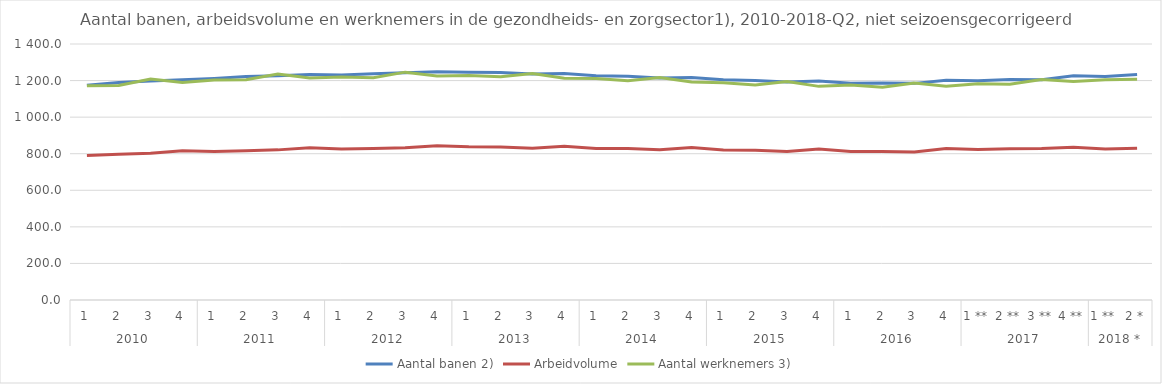
| Category | Aantal banen 2) | Arbeidvolume | Aantal werknemers 3) |
|---|---|---|---|
| 0 | 1174.1 | 790.1 | 1171.6 |
| 1 | 1188.8 | 797.6 | 1173.6 |
| 2 | 1197.1 | 803.1 | 1208.2 |
| 3 | 1204.2 | 815.8 | 1189.1 |
| 4 | 1211.8 | 811.6 | 1203.2 |
| 5 | 1221.6 | 816.1 | 1204 |
| 6 | 1227 | 821 | 1235.5 |
| 7 | 1233.2 | 833.2 | 1213.5 |
| 8 | 1231.1 | 825.2 | 1218.9 |
| 9 | 1237.8 | 828.9 | 1215.3 |
| 10 | 1242.9 | 833 | 1246.1 |
| 11 | 1248.8 | 844.2 | 1224.5 |
| 12 | 1245.5 | 837.8 | 1228.4 |
| 13 | 1243.5 | 837 | 1221.1 |
| 14 | 1236.2 | 830.2 | 1238.1 |
| 15 | 1238.5 | 840.7 | 1212.7 |
| 16 | 1227 | 828.8 | 1211.7 |
| 17 | 1223.9 | 828.5 | 1198.5 |
| 18 | 1214.7 | 822.1 | 1216.6 |
| 19 | 1217.1 | 833.9 | 1192.3 |
| 20 | 1204.6 | 820.4 | 1188.7 |
| 21 | 1200.6 | 818.4 | 1175.9 |
| 22 | 1192.1 | 811.7 | 1194.7 |
| 23 | 1197.6 | 825.1 | 1168.3 |
| 24 | 1185.6 | 811.6 | 1175.2 |
| 25 | 1187.4 | 811.8 | 1164 |
| 26 | 1184.7 | 809.5 | 1186.3 |
| 27 | 1201.1 | 827.9 | 1169.3 |
| 28 | 1199.4 | 823.2 | 1182 |
| 29 | 1206.1 | 827 | 1179.9 |
| 30 | 1204.3 | 828.6 | 1205.9 |
| 31 | 1226 | 835.4 | 1194.8 |
| 32 | 1222.7 | 825.9 | 1205.1 |
| 33 | 1232.9 | 830 | 1206.7 |